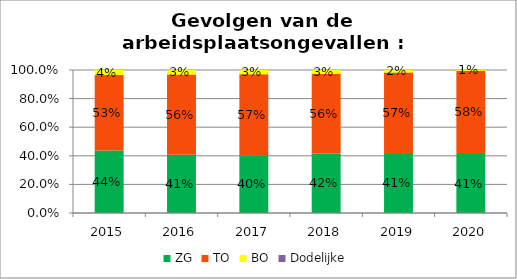
| Category | ZG | TO | BO | Dodelijke |
|---|---|---|---|---|
| 2015.0 | 0.438 | 0.527 | 0.035 | 0 |
| 2016.0 | 0.407 | 0.561 | 0.032 | 0 |
| 2017.0 | 0.404 | 0.567 | 0.029 | 0 |
| 2018.0 | 0.415 | 0.559 | 0.025 | 0 |
| 2019.0 | 0.413 | 0.57 | 0.017 | 0 |
| 2020.0 | 0.412 | 0.581 | 0.006 | 0 |